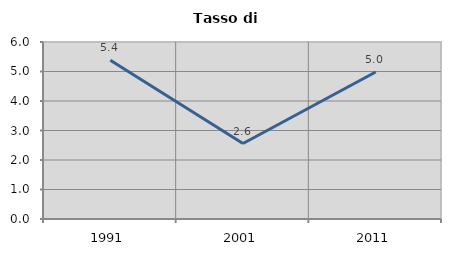
| Category | Tasso di disoccupazione   |
|---|---|
| 1991.0 | 5.379 |
| 2001.0 | 2.559 |
| 2011.0 | 4.983 |